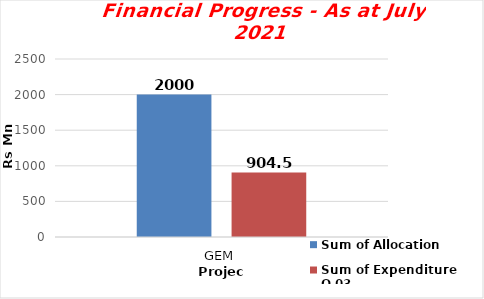
| Category | Sum of Allocation  | Sum of Expenditure Q 03 |
|---|---|---|
| GEM | 2000 | 904.5 |